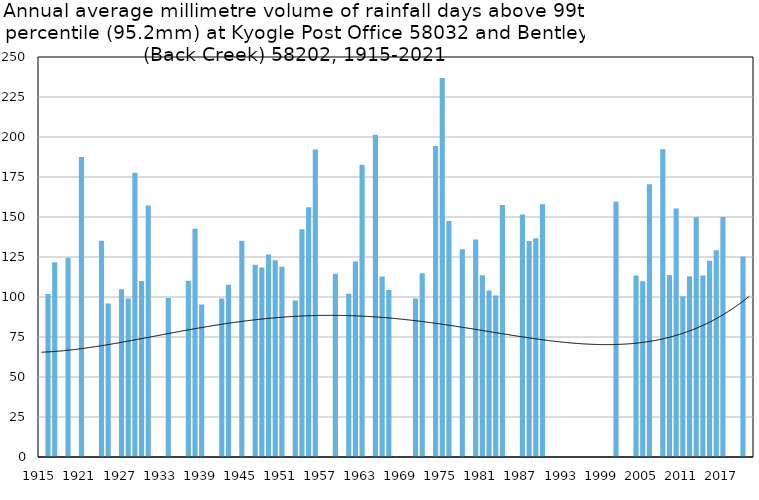
| Category | Annual average mm in days above 99th percentile |
|---|---|
| 1915 | 0 |
| 1916 | 101.85 |
| 1917 | 121.7 |
| 1918 | 0 |
| 1919 | 124.5 |
| 1920 | 0 |
| 1921 | 187.45 |
| 1922 | 0 |
| 1923 | 0 |
| 1924 | 135.1 |
| 1925 | 96 |
| 1926 | 0 |
| 1927 | 104.9 |
| 1928 | 99.1 |
| 1929 | 177.733 |
| 1930 | 110 |
| 1931 | 157.167 |
| 1932 | 0 |
| 1933 | 0 |
| 1934 | 99.3 |
| 1935 | 0 |
| 1936 | 0 |
| 1937 | 110.2 |
| 1938 | 142.6 |
| 1939 | 95.3 |
| 1940 | 0 |
| 1941 | 0 |
| 1942 | 99.1 |
| 1943 | 107.7 |
| 1944 | 0 |
| 1945 | 135.1 |
| 1946 | 0 |
| 1947 | 120.1 |
| 1948 | 118.433 |
| 1949 | 126.5 |
| 1950 | 122.9 |
| 1951 | 118.967 |
| 1952 | 0 |
| 1953 | 97.8 |
| 1954 | 142.333 |
| 1955 | 156.05 |
| 1956 | 192.15 |
| 1957 | 0 |
| 1958 | 0 |
| 1959 | 114.6 |
| 1960 | 0 |
| 1961 | 102.1 |
| 1962 | 122.2 |
| 1963 | 182.6 |
| 1964 | 0 |
| 1965 | 201.4 |
| 1966 | 112.8 |
| 1967 | 104.4 |
| 1968 | 0 |
| 1969 | 0 |
| 1970 | 0 |
| 1971 | 99.1 |
| 1972 | 114.8 |
| 1973 | 0 |
| 1974 | 194.3 |
| 1975 | 236.8 |
| 1976 | 147.45 |
| 1977 | 0 |
| 1978 | 129.9 |
| 1979 | 0 |
| 1980 | 136 |
| 1981 | 113.6 |
| 1982 | 104 |
| 1983 | 101 |
| 1984 | 157.5 |
| 1985 | 0 |
| 1986 | 0 |
| 1987 | 151.5 |
| 1988 | 135 |
| 1989 | 136.667 |
| 1990 | 158 |
| 1991 | 0 |
| 1992 | 0 |
| 1993 | 0 |
| 1994 | 0 |
| 1995 | 0 |
| 1996 | 0 |
| 1997 | 0 |
| 1998 | 0 |
| 1999 | 0 |
| 2000 | 0 |
| 2001 | 159.6 |
| 2002 | 0 |
| 2003 | 0 |
| 2004 | 113.4 |
| 2005 | 109.8 |
| 2006 | 170.5 |
| 2007 | 0 |
| 2008 | 192.4 |
| 2009 | 113.8 |
| 2010 | 155.3 |
| 2011 | 100.4 |
| 2012 | 113 |
| 2013 | 149.8 |
| 2014 | 113.5 |
| 2015 | 122.7 |
| 2016 | 129.2 |
| 2017 | 150 |
| 2018 | 0 |
| 2019 | 0 |
| 2020 | 125.333 |
| 2021 | 0 |